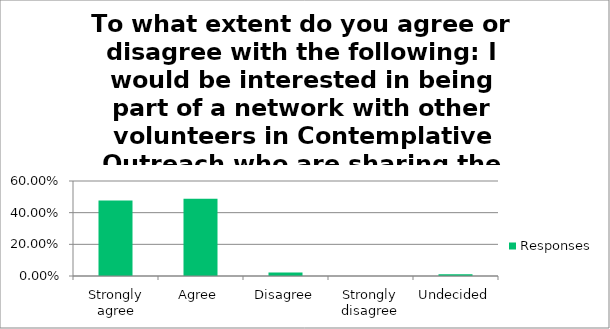
| Category | Responses |
|---|---|
| Strongly agree | 0.477 |
| Agree | 0.489 |
| Disagree | 0.023 |
| Strongly disagree | 0 |
| Undecided | 0.011 |